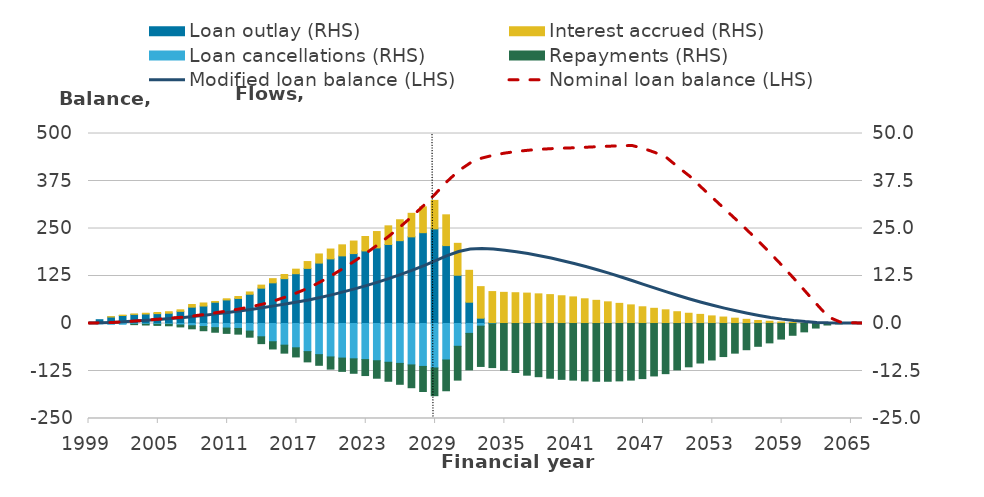
| Category | Loan outlay (RHS) | Interest accrued (RHS) | Loan cancellations (RHS) | Repayments (RHS) |
|---|---|---|---|---|
| 1999.0 | 0.3 | 0 | 0 | 0 |
| 2000.0 | 1 | 0 | -0.1 | 0 |
| 2001.0 | 1.7 | 0.1 | -0.2 | 0 |
| 2002.0 | 2.1 | 0.1 | -0.2 | 0 |
| 2003.0 | 2.4 | 0.1 | -0.2 | -0.1 |
| 2004.0 | 2.5 | 0.2 | -0.2 | -0.2 |
| 2005.0 | 2.6 | 0.3 | -0.2 | -0.3 |
| 2006.0 | 2.7 | 0.4 | -0.2 | -0.4 |
| 2007.0 | 3.2 | 0.4 | -0.4 | -0.5 |
| 2008.0 | 4.3 | 0.7 | -0.6 | -0.8 |
| 2009.0 | 4.6 | 0.8 | -0.8 | -1.1 |
| 2010.0 | 5.6 | 0.2 | -1.1 | -1.2 |
| 2011.0 | 6.2 | 0.3 | -1.2 | -1.4 |
| 2012.0 | 6.6 | 0.5 | -1.3 | -1.5 |
| 2013.0 | 7.7 | 0.6 | -2 | -1.6 |
| 2014.0 | 9.3 | 0.8 | -3.5 | -1.8 |
| 2015.0 | 10.7 | 1.1 | -4.8 | -1.9 |
| 2016.0 | 11.8 | 1.1 | -5.7 | -2.1 |
| 2017.0 | 13.1 | 1.2 | -6.4 | -2.4 |
| 2018.0 | 14.5 | 1.8 | -7.4 | -2.7 |
| 2019.0 | 15.9 | 2.4 | -8.2 | -2.8 |
| 2020.0 | 17 | 2.6 | -8.8 | -3.2 |
| 2021.0 | 17.8 | 2.9 | -9.1 | -3.5 |
| 2022.0 | 18.4 | 3.3 | -9.3 | -3.8 |
| 2023.0 | 19.1 | 3.8 | -9.5 | -4.2 |
| 2024.0 | 19.9 | 4.3 | -9.8 | -4.6 |
| 2025.0 | 20.8 | 4.9 | -10.2 | -5 |
| 2026.0 | 21.8 | 5.5 | -10.5 | -5.5 |
| 2027.0 | 22.8 | 6.2 | -10.9 | -6 |
| 2028.0 | 23.9 | 6.8 | -11.3 | -6.6 |
| 2029.0 | 24.9 | 7.5 | -11.7 | -7.3 |
| 2030.0 | 20.5 | 8.1 | -9.6 | -8.1 |
| 2031.0 | 12.7 | 8.4 | -6 | -8.9 |
| 2032.0 | 5.6 | 8.4 | -2.6 | -9.6 |
| 2033.0 | 1.4 | 8.3 | -0.7 | -10.6 |
| 2034.0 | 0.2 | 8.2 | -0.1 | -11.5 |
| 2035.0 | 0 | 8.2 | 0 | -12.3 |
| 2036.0 | 0 | 8.1 | 0 | -12.9 |
| 2037.0 | 0 | 8 | 0 | -13.6 |
| 2038.0 | 0 | 7.8 | 0 | -14 |
| 2039.0 | 0 | 7.6 | 0 | -14.4 |
| 2040.0 | 0 | 7.3 | 0 | -14.7 |
| 2041.0 | 0 | 7 | 0 | -14.9 |
| 2042.0 | 0 | 6.5 | 0 | -15.1 |
| 2043.0 | 0 | 6.1 | 0 | -15.2 |
| 2044.0 | 0 | 5.7 | 0 | -15.2 |
| 2045.0 | 0 | 5.3 | 0 | -15.1 |
| 2046.0 | 0 | 4.9 | 0 | -14.9 |
| 2047.0 | 0 | 4.4 | 0 | -14.5 |
| 2048.0 | 0 | 4 | 0 | -13.8 |
| 2049.0 | 0 | 3.6 | 0 | -13.2 |
| 2050.0 | 0 | 3.1 | 0 | -12.2 |
| 2051.0 | 0 | 2.7 | 0 | -11.4 |
| 2052.0 | 0 | 2.4 | 0 | -10.4 |
| 2053.0 | 0 | 2 | 0 | -9.6 |
| 2054.0 | 0 | 1.7 | 0 | -8.7 |
| 2055.0 | 0 | 1.4 | 0 | -7.8 |
| 2056.0 | 0 | 1.1 | 0 | -6.9 |
| 2057.0 | 0 | 0.8 | 0 | -6 |
| 2058.0 | 0 | 0.6 | 0 | -5.1 |
| 2059.0 | 0 | 0.4 | 0 | -4.1 |
| 2060.0 | 0 | 0.3 | 0 | -3.1 |
| 2061.0 | 0 | 0.1 | 0 | -2.2 |
| 2062.0 | 0 | 0.1 | 0 | -1.2 |
| 2063.0 | 0 | 0 | 0 | -0.4 |
| 2064.0 | 0 | 0 | 0 | -0.1 |
| 2065.0 | 0 | 0 | 0 | 0 |
| 2066.0 | 0 | 0 | 0 | 0 |